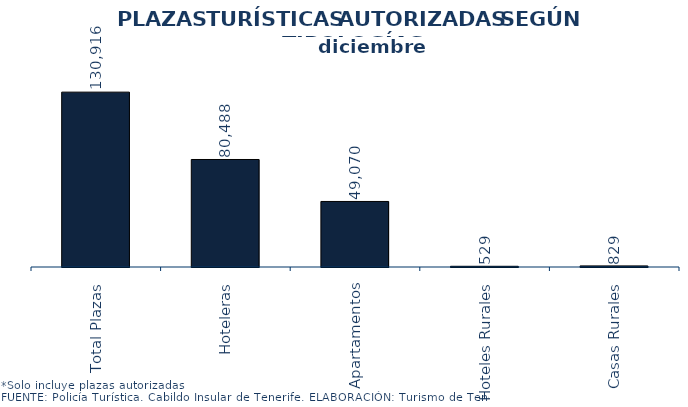
| Category | PLAZAS TURISTICAS AUTORIZADAS SEGÚN TIPOLOGÍA DEL ESTABLECIMIENTO.
Municipios e Isla diciembre 2013 |
|---|---|
| Total Plazas | 130916 |
| Hoteleras | 80488 |
| Apartamentos | 49070 |
| Hoteles Rurales | 529 |
| Casas Rurales | 829 |